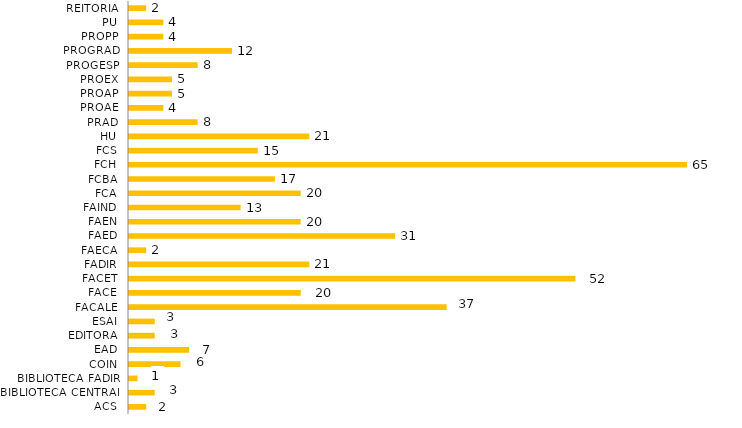
| Category | Lotação/Ano |
|---|---|
| ACS | 2 |
| BIBLIOTECA CENTRAL | 3 |
| BIBLIOTECA FADIR | 1 |
| COIN | 6 |
| EAD | 7 |
| EDITORA | 3 |
| ESAI | 3 |
| FACALE | 37 |
| FACE | 20 |
| FACET | 52 |
| FADIR | 21 |
| FAECA | 2 |
| FAED | 31 |
| FAEN | 20 |
| FAIND | 13 |
| FCA | 20 |
| FCBA | 17 |
| FCH | 65 |
| FCS | 15 |
| HU | 21 |
| PRAD | 8 |
| PROAE | 4 |
| PROAP | 5 |
| PROEX | 5 |
| PROGESP | 8 |
| PROGRAD | 12 |
| PROPP | 4 |
| PU | 4 |
| REITORIA | 2 |